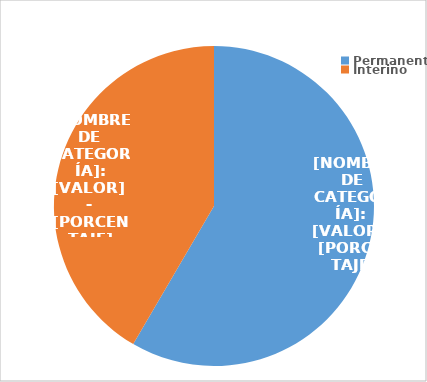
| Category | Series 0 |
|---|---|
| Permanente | 3243 |
| Interino | 2308 |